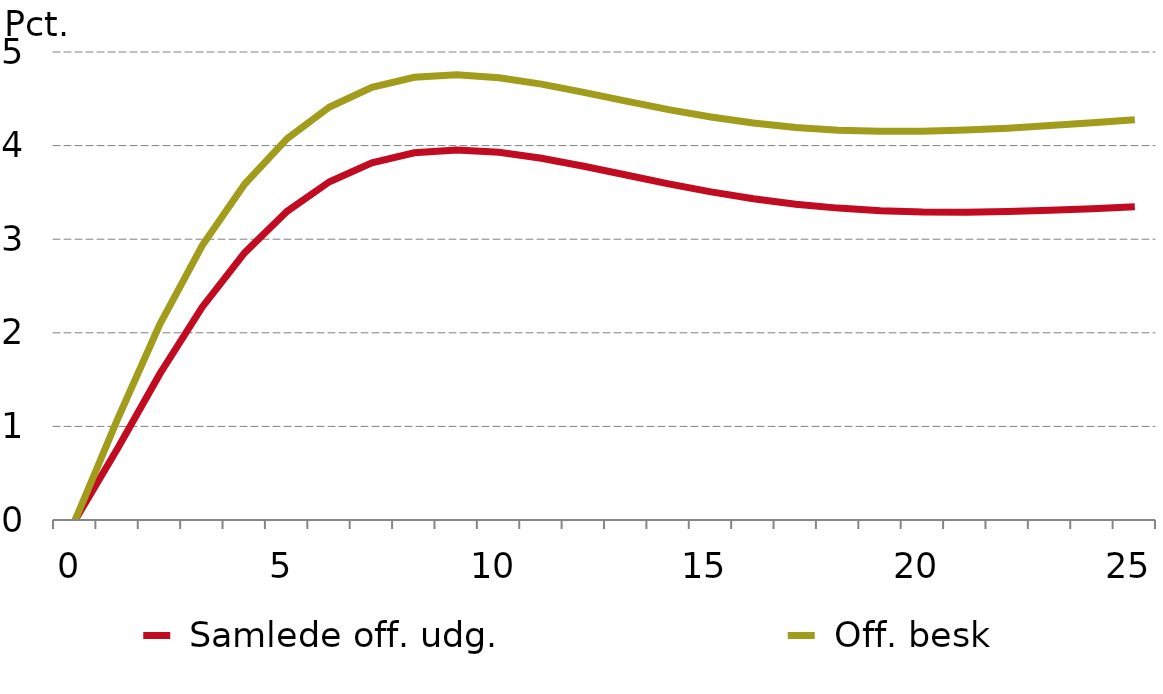
| Category |  Samlede off. udg. |  Off. besk |
|---|---|---|
| 0.0 | 0 | 0 |
| nan | 0.764 | 1.078 |
| nan | 1.563 | 2.094 |
| nan | 2.276 | 2.935 |
| nan | 2.856 | 3.589 |
| 5.0 | 3.298 | 4.075 |
| nan | 3.614 | 4.413 |
| nan | 3.817 | 4.623 |
| nan | 3.923 | 4.73 |
| nan | 3.954 | 4.756 |
| 10.0 | 3.929 | 4.725 |
| nan | 3.865 | 4.657 |
| nan | 3.78 | 4.569 |
| nan | 3.685 | 4.475 |
| nan | 3.592 | 4.384 |
| 15.0 | 3.506 | 4.305 |
| nan | 3.433 | 4.241 |
| nan | 3.374 | 4.195 |
| nan | 3.332 | 4.165 |
| nan | 3.305 | 4.152 |
| 20.0 | 3.291 | 4.153 |
| nan | 3.289 | 4.166 |
| nan | 3.296 | 4.187 |
| nan | 3.309 | 4.214 |
| nan | 3.327 | 4.244 |
| 25.0 | 3.346 | 4.275 |